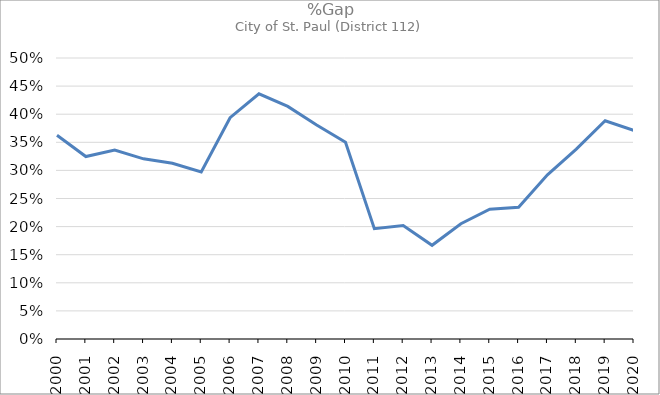
| Category | Series 0 |
|---|---|
| 2000.0 | 0.363 |
| 2001.0 | 0.325 |
| 2002.0 | 0.336 |
| 2003.0 | 0.321 |
| 2004.0 | 0.313 |
| 2005.0 | 0.297 |
| 2006.0 | 0.394 |
| 2007.0 | 0.436 |
| 2008.0 | 0.414 |
| 2009.0 | 0.381 |
| 2010.0 | 0.35 |
| 2011.0 | 0.196 |
| 2012.0 | 0.202 |
| 2013.0 | 0.167 |
| 2014.0 | 0.205 |
| 2015.0 | 0.231 |
| 2016.0 | 0.234 |
| 2017.0 | 0.292 |
| 2018.0 | 0.338 |
| 2019.0 | 0.388 |
| 2020.0 | 0.371 |